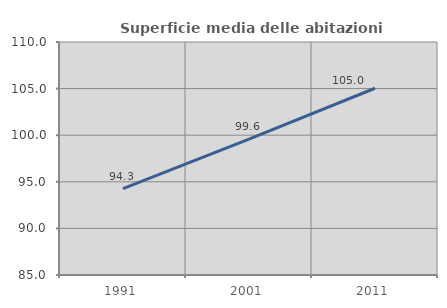
| Category | Superficie media delle abitazioni occupate |
|---|---|
| 1991.0 | 94.274 |
| 2001.0 | 99.581 |
| 2011.0 | 105.038 |